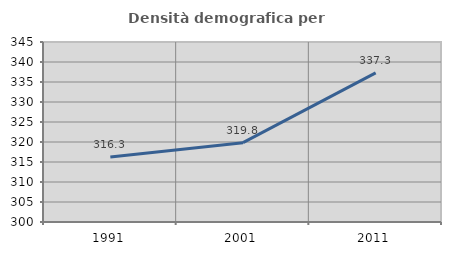
| Category | Densità demografica |
|---|---|
| 1991.0 | 316.266 |
| 2001.0 | 319.838 |
| 2011.0 | 337.283 |